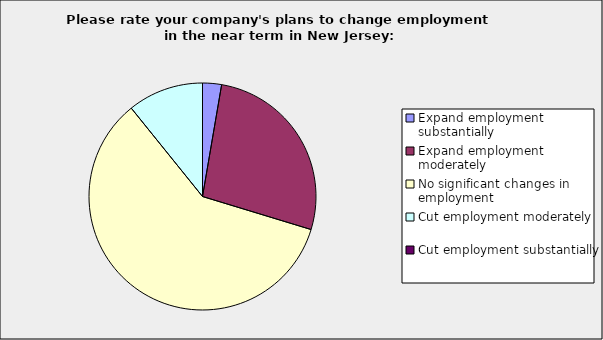
| Category | Series 0 |
|---|---|
| Expand employment substantially | 0.027 |
| Expand employment moderately | 0.27 |
| No significant changes in employment | 0.595 |
| Cut employment moderately | 0.108 |
| Cut employment substantially | 0 |